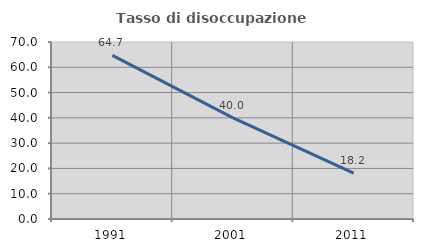
| Category | Tasso di disoccupazione giovanile  |
|---|---|
| 1991.0 | 64.706 |
| 2001.0 | 40 |
| 2011.0 | 18.182 |